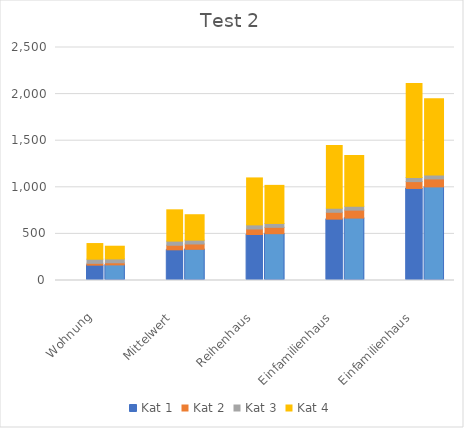
| Category | Kat 1 | Kat 2 | Kat 3 | Kat 4 |
|---|---|---|---|---|
| Wohnung | 164.61 | 19.6 | 44.4 | 167.865 |
| Mittelwert | 329.22 | 49 | 44.4 | 335.73 |
| Reihenhaus | 493.83 | 58.8 | 44.4 | 503.595 |
| Einfamilienhaus | 658.44 | 73.5 | 44.4 | 671.46 |
| Einfamilienhaus | 987.66 | 73.5 | 44.4 | 1007.19 |